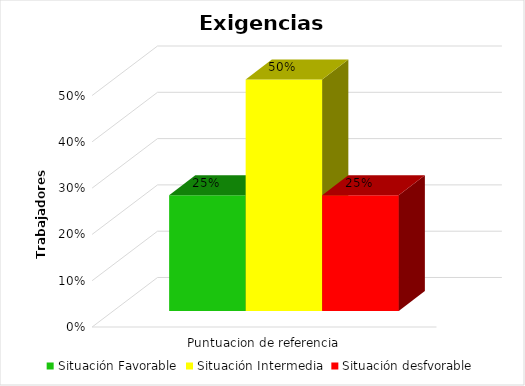
| Category | Situación Favorable | Situación Intermedia | Situación desfvorable |
|---|---|---|---|
| 0 | 0.25 | 0.5 | 0.25 |